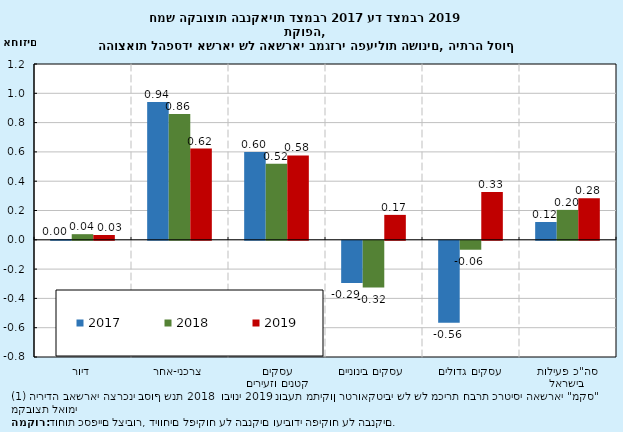
| Category | 2017 | 2018 | 2019 |
|---|---|---|---|
| דיור | 0.005 | 0.038 | 0.033 |
| צרכני-אחר | 0.941 | 0.858 | 0.622 |
| עסקים קטנים וזעירים | 0.599 | 0.519 | 0.576 |
| עסקים בינוניים | -0.288 | -0.32 | 0.17 |
| עסקים גדולים | -0.559 | -0.061 | 0.326 |
| סה"כ פעילות בישראל | 0.121 | 0.204 | 0.283 |